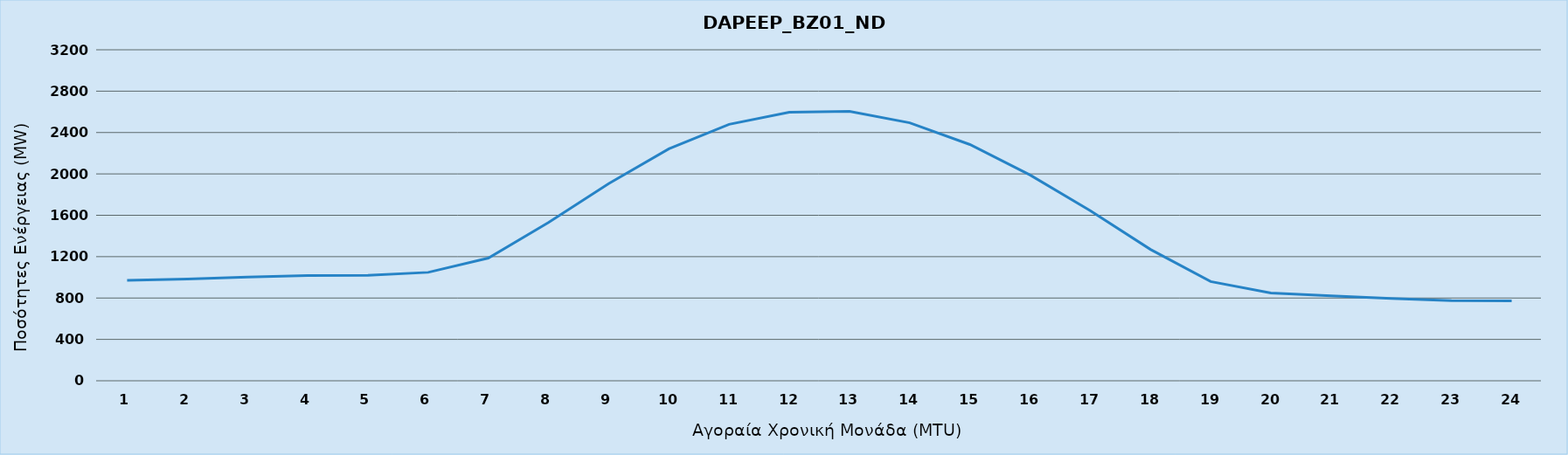
| Category | DAPEEP_BZ01_NDR |
|---|---|
| 0 | 970 |
| 1 | 984 |
| 2 | 1002 |
| 3 | 1017 |
| 4 | 1020 |
| 5 | 1048 |
| 6 | 1186 |
| 7 | 1531 |
| 8 | 1906 |
| 9 | 2242 |
| 10 | 2479 |
| 11 | 2596 |
| 12 | 2604 |
| 13 | 2494 |
| 14 | 2284 |
| 15 | 1989 |
| 16 | 1645 |
| 17 | 1270 |
| 18 | 959 |
| 19 | 848 |
| 20 | 822 |
| 21 | 795 |
| 22 | 775 |
| 23 | 773 |